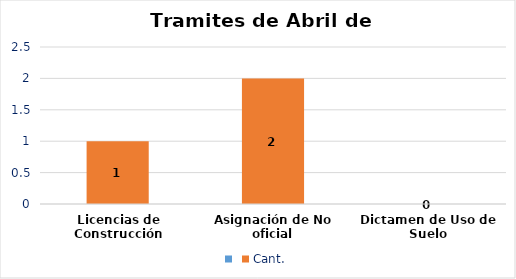
| Category | Series 0 | Cant. |
|---|---|---|
| Licencias de Construcción |  | 1 |
| Asignación de No oficial |  | 2 |
| Dictamen de Uso de Suelo |  | 0 |